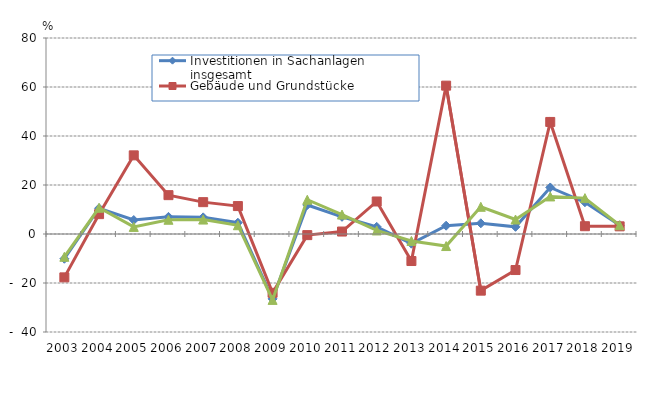
| Category | Investitionen in Sachanlagen insgesamt | Gebäude und Grundstücke | Maschinen und Betriebsausstattung |
|---|---|---|---|
| 2003.0 | -10.1 | -17.7 | -9.3 |
| 2004.0 | 10.5 | 8.1 | 10.7 |
| 2005.0 | 5.7 | 32.1 | 2.9 |
| 2006.0 | 6.991 | 15.857 | 5.812 |
| 2007.0 | 6.796 | 13.004 | 5.891 |
| 2008.0 | 4.6 | 11.4 | 3.579 |
| 2009.0 | -26.476 | -23.99 | -26.892 |
| 2010.0 | 11.843 | -0.455 | 13.982 |
| 2011.0 | 7.019 | 1.003 | 7.933 |
| 2012.0 | 2.918 | 13.273 | 1.446 |
| 2013.0 | -3.946 | -11.028 | -2.822 |
| 2014.0 | 3.39 | 60.554 | -4.916 |
| 2015.0 | 4.363 | -23.122 | 11.106 |
| 2016.0 | 2.923 | -14.713 | 5.917 |
| 2017.0 | 18.993 | 45.739 | 15.337 |
| 2018.0 | 12.959 | 3.178 | 14.649 |
| 2019.0 | 3.525 | 3.127 | 3.587 |